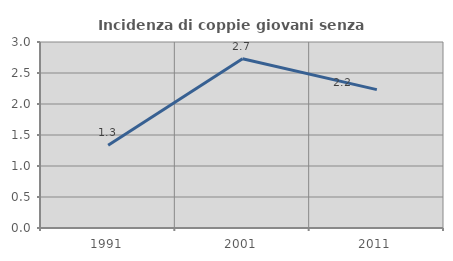
| Category | Incidenza di coppie giovani senza figli |
|---|---|
| 1991.0 | 1.333 |
| 2001.0 | 2.73 |
| 2011.0 | 2.232 |